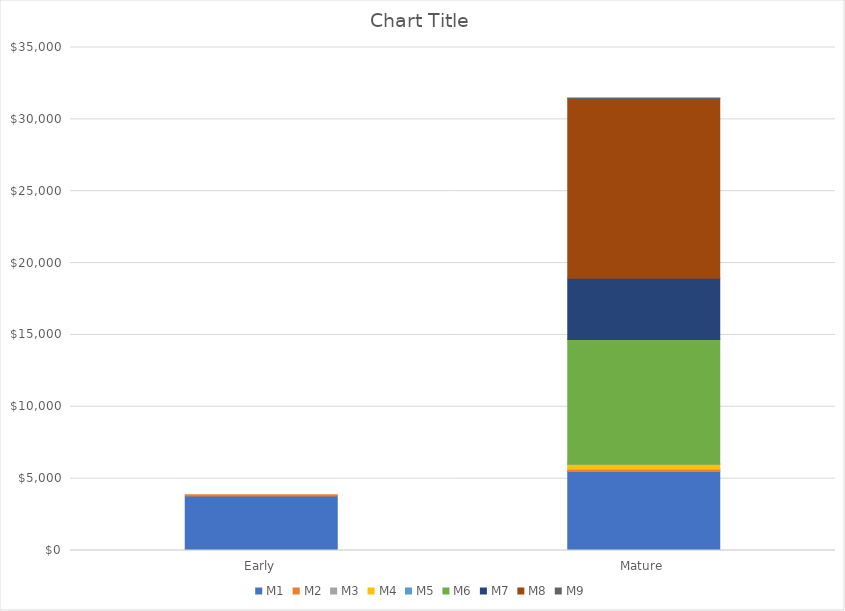
| Category | M1 | M2 | M3 | M4 | M5 | M6 | M7 | M8 | M9 |
|---|---|---|---|---|---|---|---|---|---|
| Early | 3794.061 | 79.5 | 0 | 0 | 0 | 0 | 0 | 0 | 0 |
| Mature | 5497.616 | 163.1 | 11.865 | 348.268 | 4.752 | 8661.775 | 4262.531 | 12496.895 | 41.758 |